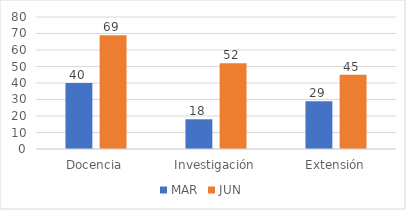
| Category | MAR | JUN |
|---|---|---|
| Docencia | 40 | 69 |
| Investigación | 18 | 52 |
| Extensión | 29 | 45 |